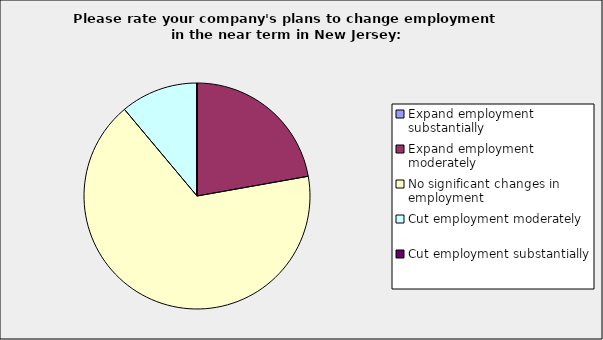
| Category | Series 0 |
|---|---|
| Expand employment substantially | 0 |
| Expand employment moderately | 0.222 |
| No significant changes in employment | 0.667 |
| Cut employment moderately | 0.111 |
| Cut employment substantially | 0 |